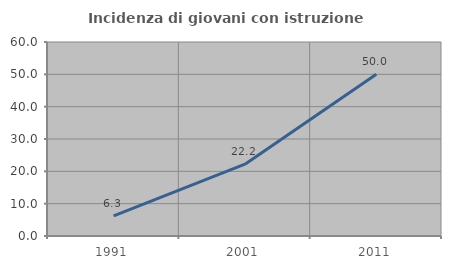
| Category | Incidenza di giovani con istruzione universitaria |
|---|---|
| 1991.0 | 6.25 |
| 2001.0 | 22.222 |
| 2011.0 | 50 |